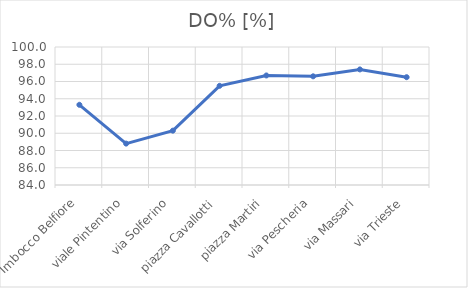
| Category | DO% [%] |
|---|---|
| Imbocco Belfiore | 93.3 |
| viale Pintentino | 88.8 |
| via Solferino | 90.3 |
| piazza Cavallotti | 95.5 |
| piazza Martiri | 96.7 |
| via Pescheria | 96.6 |
| via Massari | 97.4 |
| via Trieste | 96.5 |